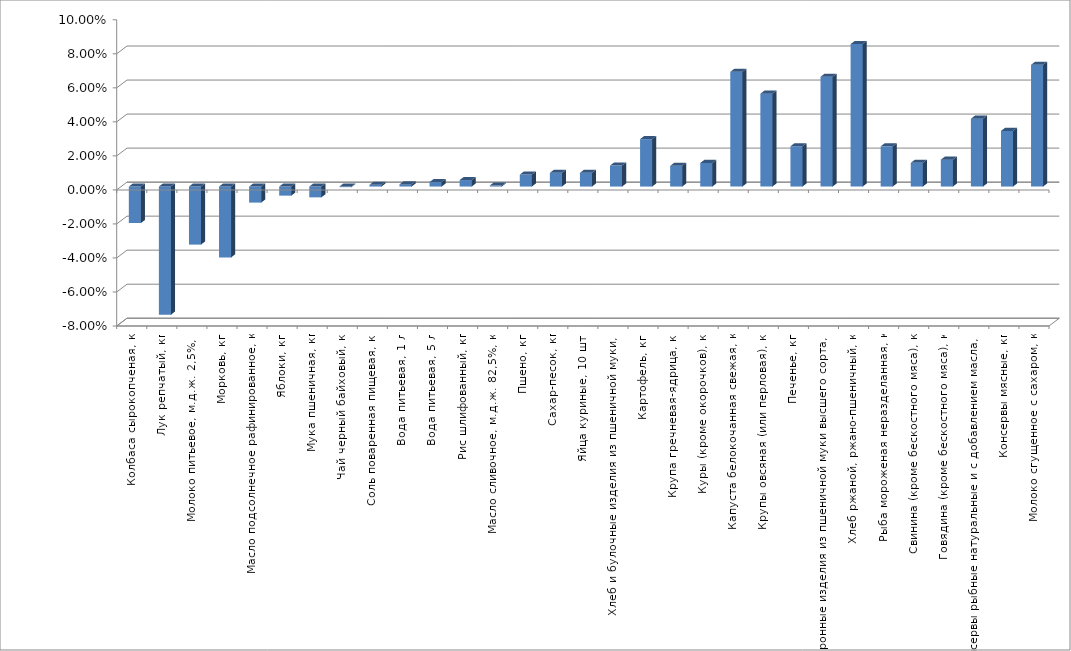
| Category | Series 0 |
|---|---|
| Колбаса сырокопченая, кг | -0.021 |
| Лук репчатый, кг | -0.075 |
| Молоко питьевое, м.д.ж. 2,5%, л | -0.034 |
| Морковь, кг | -0.042 |
| Масло подсолнечное рафинированное, кг | -0.009 |
| Яблоки, кг | -0.005 |
| Мука пшеничная, кг | -0.006 |
| Чай черный байховый, кг | 0 |
| Соль поваренная пищевая, кг | 0.001 |
| Вода питьевая, 1 л | 0.001 |
| Вода питьевая, 5 л | 0.003 |
| Рис шлифованный, кг | 0.004 |
| Масло сливочное, м.д.ж. 82,5%, кг | 0.001 |
| Пшено, кг | 0.007 |
| Сахар-песок, кг | 0.008 |
| Яйца куриные, 10 шт. | 0.008 |
| Хлеб и булочные изделия из пшеничной муки, кг | 0.012 |
| Картофель, кг | 0.028 |
| Крупа гречневая-ядрица, кг | 0.012 |
| Куры (кроме окорочков), кг | 0.014 |
| Капуста белокочанная свежая, кг | 0.067 |
| Крупы овсяная (или перловая), кг | 0.055 |
| Печенье, кг | 0.024 |
| Макаронные изделия из пшеничной муки высшего сорта, кг | 0.065 |
| Хлеб ржаной, ржано-пшеничный, кг | 0.084 |
| Рыба мороженая неразделанная, кг | 0.024 |
| Свинина (кроме бескостного мяса), кг | 0.014 |
| Говядина (кроме бескостного мяса), кг | 0.016 |
| Консервы рыбные натуральные и с добавлением масла, кг | 0.04 |
| Консервы мясные, кг | 0.033 |
| Молоко сгущенное с сахаром, кг | 0.072 |